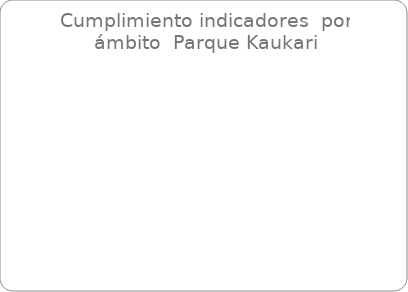
| Category | Parque 3 |
|---|---|
| Entorno | 0 |
| Medio ambiente | 0 |
| Social | 0 |
| Económico | 0 |